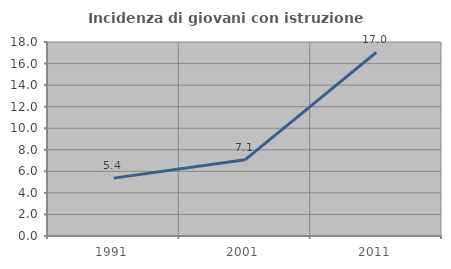
| Category | Incidenza di giovani con istruzione universitaria |
|---|---|
| 1991.0 | 5.369 |
| 2001.0 | 7.065 |
| 2011.0 | 17.037 |